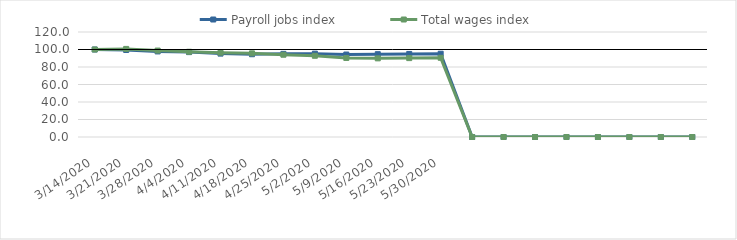
| Category | Payroll jobs index | Total wages index |
|---|---|---|
| 14/03/2020 | 100 | 100 |
| 21/03/2020 | 99.415 | 100.668 |
| 28/03/2020 | 97.791 | 98.796 |
| 04/04/2020 | 97.018 | 97.4 |
| 11/04/2020 | 95.305 | 96.376 |
| 18/04/2020 | 94.583 | 95.592 |
| 25/04/2020 | 95.004 | 94.012 |
| 02/05/2020 | 95.264 | 92.813 |
| 09/05/2020 | 94.233 | 90.309 |
| 16/05/2020 | 94.657 | 89.866 |
| 23/05/2020 | 94.919 | 90.148 |
| 30/05/2020 | 95.167 | 90.52 |